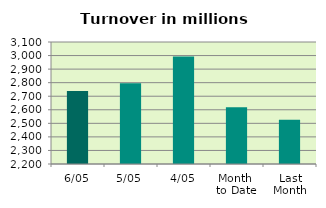
| Category | Series 0 |
|---|---|
| 6/05 | 2738.285 |
| 5/05 | 2795.491 |
| 4/05 | 2992.383 |
| Month 
to Date | 2617.958 |
| Last
Month | 2525.558 |